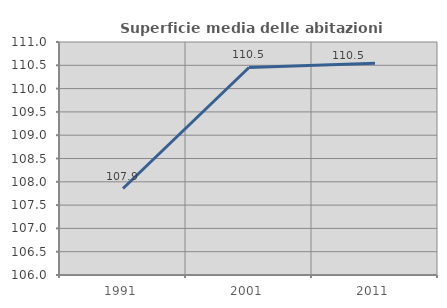
| Category | Superficie media delle abitazioni occupate |
|---|---|
| 1991.0 | 107.856 |
| 2001.0 | 110.454 |
| 2011.0 | 110.543 |